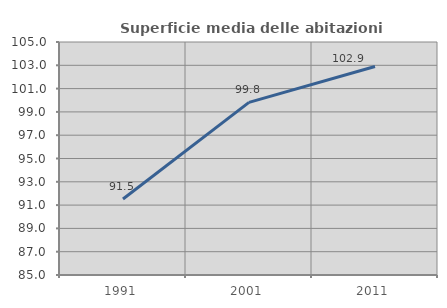
| Category | Superficie media delle abitazioni occupate |
|---|---|
| 1991.0 | 91.519 |
| 2001.0 | 99.819 |
| 2011.0 | 102.896 |